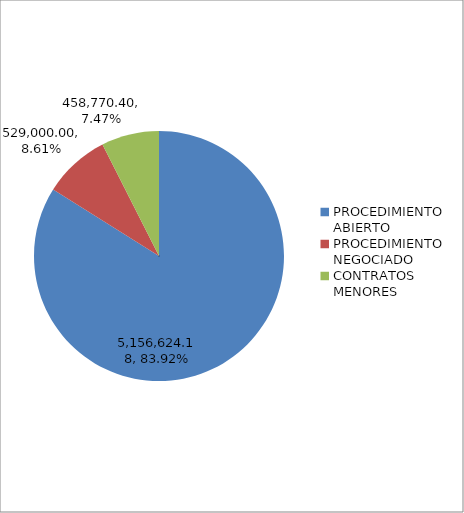
| Category | Series 0 | Series 1 |
|---|---|---|
| PROCEDIMIENTO ABIERTO  | 5156624.18 | 83.924 |
| PROCEDIMIENTO NEGOCIADO | 529000 | 8.609 |
| CONTRATOS MENORES | 458770.405 | 7.466 |